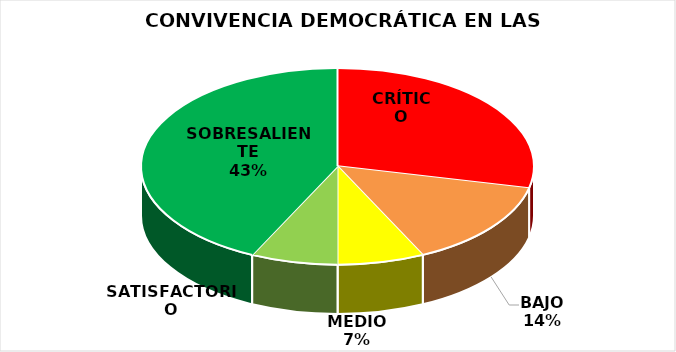
| Category | Series 0 |
|---|---|
| CRÍTICO | 4 |
| BAJO | 2 |
| MEDIO | 1 |
| SATISFACTORIO | 1 |
| SOBRESALIENTE | 6 |